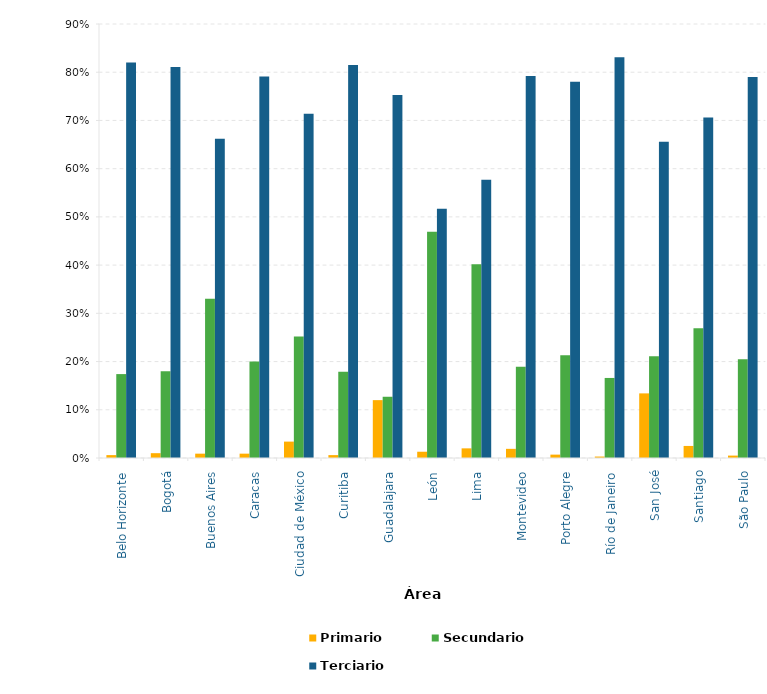
| Category | Primario | Secundario | Terciario |
|---|---|---|---|
| _x000e_Belo Horizonte | 0.006 | 0.174 | 0.82 |
| _x0006_Bogotá | 0.01 | 0.18 | 0.811 |
| _x000c_Buenos Aires | 0.009 | 0.33 | 0.662 |
| _x0007_Caracas | 0.009 | 0.2 | 0.791 |
| _x0010_Ciudad de México | 0.034 | 0.252 | 0.714 |
| _x0008_Curitiba | 0.006 | 0.179 | 0.815 |
| _x000b_Guadalajara | 0.12 | 0.127 | 0.753 |
| _x0004_León | 0.013 | 0.469 | 0.517 |
| _x0004_Lima | 0.02 | 0.402 | 0.577 |
| 
Montevideo | 0.019 | 0.189 | 0.792 |
| _x000c_Porto Alegre | 0.007 | 0.213 | 0.78 |
| _x000e_Río de Janeiro | 0.003 | 0.166 | 0.831 |
| _x0008_San José | 0.134 | 0.211 | 0.656 |
| _x0008_Santiago | 0.025 | 0.269 | 0.706 |
| 	São Paulo | 0.005 | 0.205 | 0.79 |